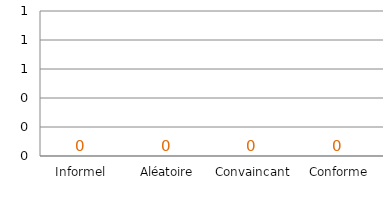
| Category | Series 0 |
|---|---|
| Informel | 0 |
| Aléatoire | 0 |
| Convaincant | 0 |
| Conforme | 0 |